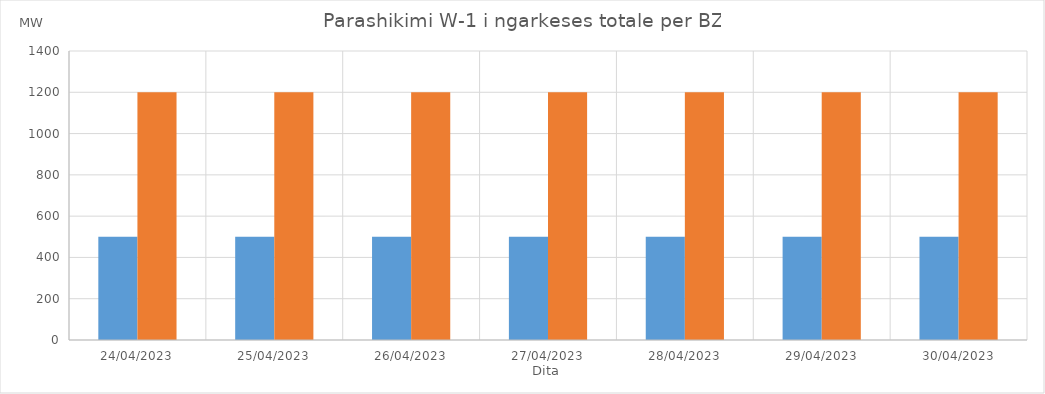
| Category | Min (MW) | Max (MW) |
|---|---|---|
| 24/04/2023 | 500 | 1200 |
| 25/04/2023 | 500 | 1200 |
| 26/04/2023 | 500 | 1200 |
| 27/04/2023 | 500 | 1200 |
| 28/04/2023 | 500 | 1200 |
| 29/04/2023 | 500 | 1200 |
| 30/04/2023 | 500 | 1200 |